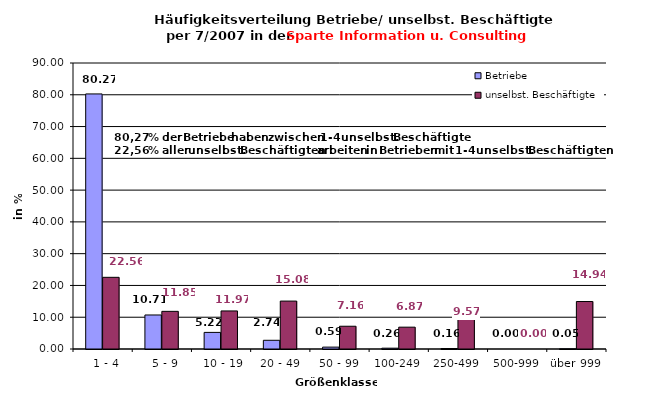
| Category | Betriebe | unselbst. Beschäftigte |
|---|---|---|
|   1 - 4 | 80.269 | 22.557 |
|   5 - 9 | 10.706 | 11.847 |
|  10 - 19 | 5.224 | 11.973 |
| 20 - 49 | 2.741 | 15.076 |
| 50 - 99 | 0.595 | 7.162 |
| 100-249 | 0.259 | 6.87 |
| 250-499 | 0.155 | 9.572 |
| 500-999 | 0 | 0 |
| über 999 | 0.052 | 14.941 |